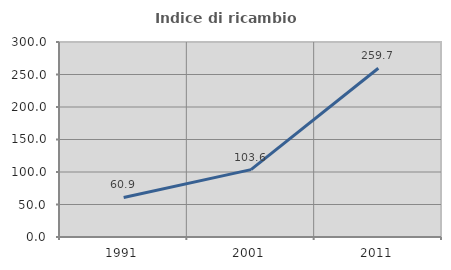
| Category | Indice di ricambio occupazionale  |
|---|---|
| 1991.0 | 60.902 |
| 2001.0 | 103.611 |
| 2011.0 | 259.685 |